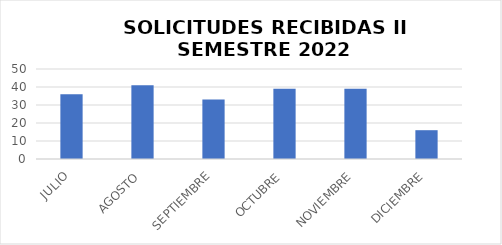
| Category | Series 0 |
|---|---|
| JULIO | 36 |
| AGOSTO | 41 |
| SEPTIEMBRE | 33 |
| OCTUBRE | 39 |
| NOVIEMBRE | 39 |
| DICIEMBRE | 16 |